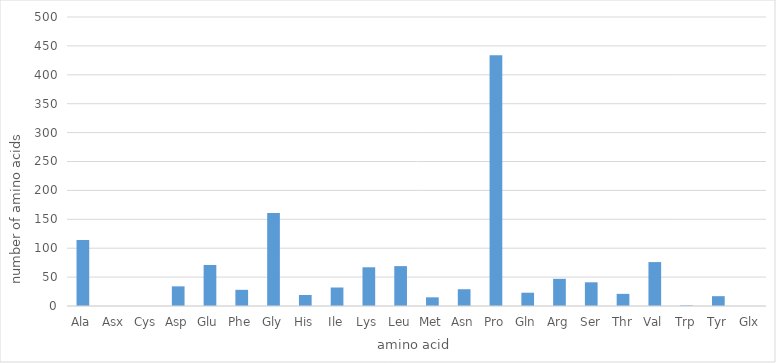
| Category | Series 0 |
|---|---|
| Ala | 114 |
| Asx | 0 |
| Cys | 0 |
| Asp | 34 |
| Glu | 71 |
| Phe | 28 |
| Gly | 161 |
| His | 19 |
| Ile | 32 |
| Lys | 67 |
| Leu | 69 |
| Met | 15 |
| Asn | 29 |
| Pro | 434 |
| Gln | 23 |
| Arg | 47 |
| Ser | 41 |
| Thr | 21 |
| Val | 76 |
| Trp | 1 |
| Tyr | 17 |
| Glx | 0 |